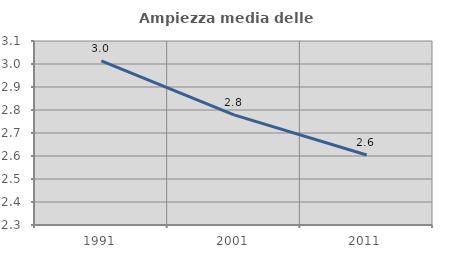
| Category | Ampiezza media delle famiglie |
|---|---|
| 1991.0 | 3.014 |
| 2001.0 | 2.779 |
| 2011.0 | 2.604 |